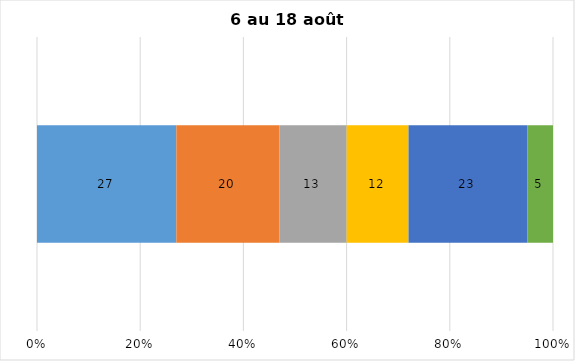
| Category | Plusieurs fois par jour | Une fois par jour | Quelques fois par semaine   | Une fois par semaine ou moins   |  Jamais   |  Je n’utilise pas les médias sociaux |
|---|---|---|---|---|---|---|
| 0 | 27 | 20 | 13 | 12 | 23 | 5 |